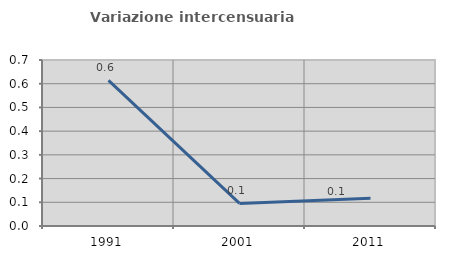
| Category | Variazione intercensuaria annua |
|---|---|
| 1991.0 | 0.614 |
| 2001.0 | 0.095 |
| 2011.0 | 0.117 |